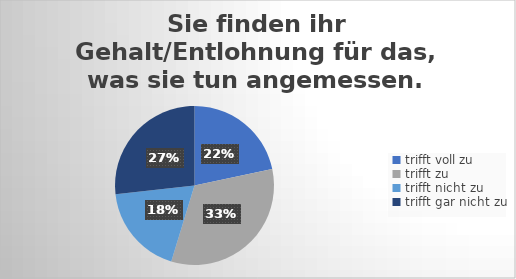
| Category | Sie finden ihr Gehalt/Entlohnung für das, was sie tun angemessen. |
|---|---|
| trifft voll zu | 55 |
| trifft zu  | 84 |
| trifft nicht zu  | 47 |
| trifft gar nicht zu | 68 |